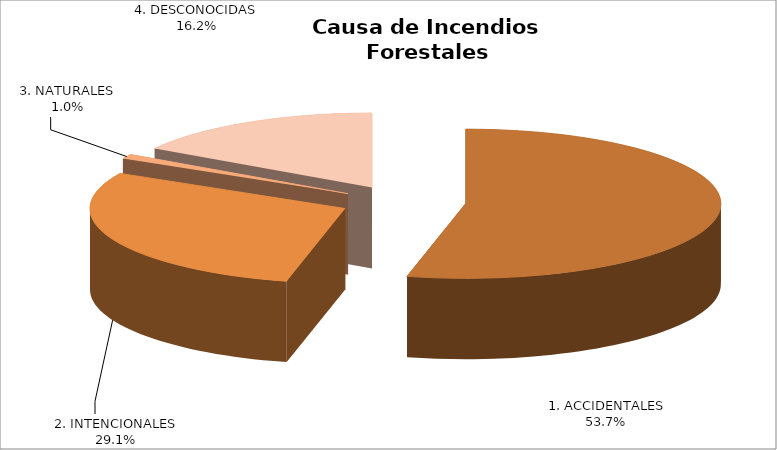
| Category | Series 0 |
|---|---|
|  1. ACCIDENTALES | 1178945.821 |
| 2. INTENCIONALES | 639733.869 |
| 3. NATURALES | 21598.982 |
| 4. DESCONOCIDAS | 355898.518 |